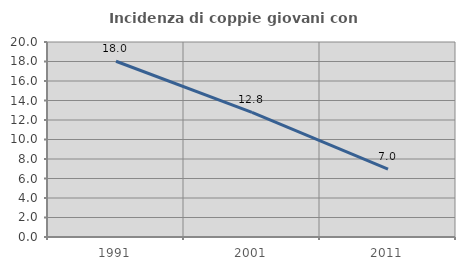
| Category | Incidenza di coppie giovani con figli |
|---|---|
| 1991.0 | 18.027 |
| 2001.0 | 12.784 |
| 2011.0 | 6.96 |